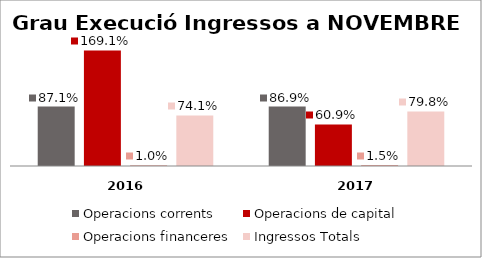
| Category | Operacions corrents | Operacions de capital | Operacions financeres | Ingressos Totals |
|---|---|---|---|---|
| 0 | 0.871 | 1.691 | 0.01 | 0.741 |
| 1 | 0.869 | 0.609 | 0.015 | 0.798 |